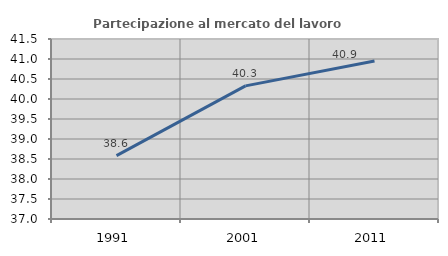
| Category | Partecipazione al mercato del lavoro  femminile |
|---|---|
| 1991.0 | 38.585 |
| 2001.0 | 40.328 |
| 2011.0 | 40.95 |